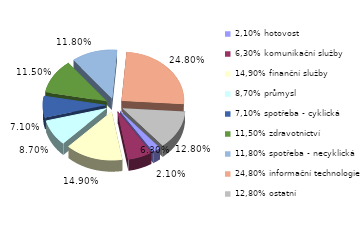
| Category | Series 0 |
|---|---|
| 2,10% hotovost | 0.021 |
| 6,30% komunikační služby | 0.063 |
| 14,90% finanční služby | 0.149 |
| 8,70% průmysl | 0.087 |
| 7,10% spotřeba - cyklická | 0.071 |
| 11,50% zdravotnictví | 0.115 |
| 11,80% spotřeba - necyklická | 0.118 |
| 24,80% informační technologie | 0.248 |
| 12,80% ostatní | 0.128 |